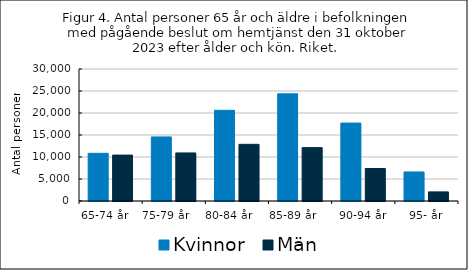
| Category | Kvinnor  | Män  |
|---|---|---|
| 65-74 år    | 10836 | 10432 |
| 75-79 år       | 14565 | 10926 |
| 80-84 år      | 20612 | 12883 |
| 85-89 år        | 24354 | 12133 |
| 90-94 år | 17713 | 7387 |
| 95- år | 6600 | 2070 |